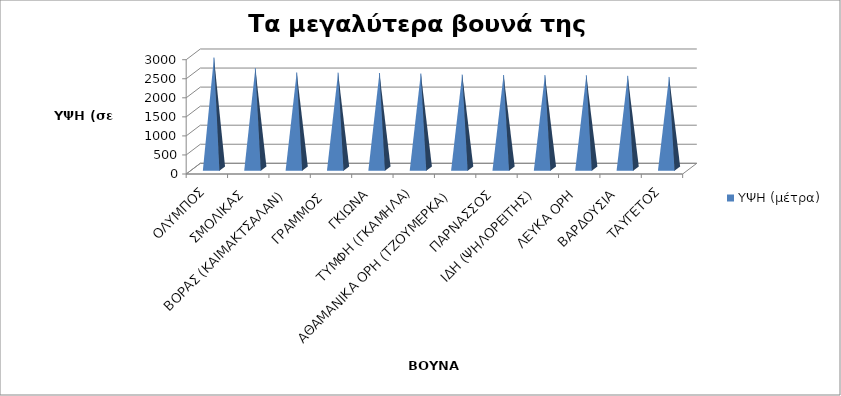
| Category | ΥΨΗ (μέτρα) |
|---|---|
| ΟΛΥΜΠΟΣ | 2917 |
| ΣΜΟΛΙΚΑΣ | 2637 |
| ΒΟΡΑΣ (ΚΑΙΜΑΚΤΣΑΛΑΝ) | 2524 |
| ΓΡΑΜΜΟΣ  | 2520 |
| ΓΚΙΩΝΑ | 2510 |
| ΤΥΜΦΗ (ΓΚΑΜΗΛΑ) | 2497 |
| ΑΘΑΜΑΝΙΚΑ ΟΡΗ (ΤΖΟΥΜΕΡΚΑ) | 2469 |
| ΠΑΡΝΑΣΣΟΣ | 2457 |
| ΙΔΗ (ΨΗΛΟΡΕΙΤΗΣ) | 2456 |
| ΛΕΥΚΑ ΟΡΗ | 2452 |
| ΒΑΡΔΟΥΣΙΑ | 2437 |
| ΤΑΥΓΕΤΟΣ | 2407 |